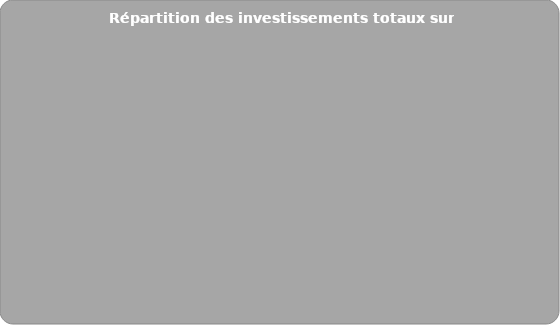
| Category | Series 0 |
|---|---|
| Financier | 0 |
| Immatériel | 0 |
| Matériel mobilier | 0 |
| Immobilier | 0 |